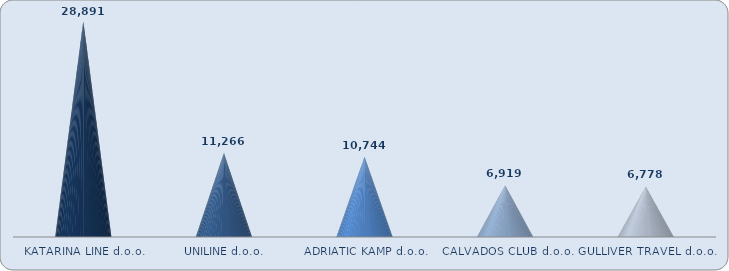
| Category | Series 0 |
|---|---|
| KATARINA LINE d.o.o. | 28891 |
| UNILINE d.o.o. | 11266 |
| ADRIATIC KAMP d.o.o. | 10744 |
| CALVADOS CLUB d.o.o. | 6919 |
| GULLIVER TRAVEL d.o.o. | 6778 |